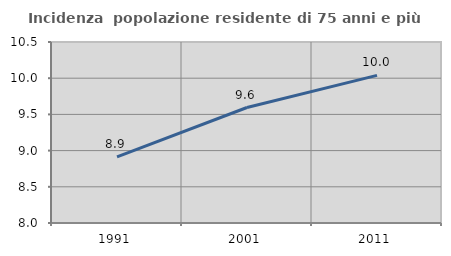
| Category | Incidenza  popolazione residente di 75 anni e più |
|---|---|
| 1991.0 | 8.914 |
| 2001.0 | 9.595 |
| 2011.0 | 10.039 |